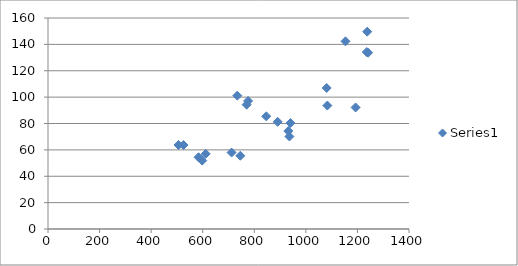
| Category | Series 0 |
|---|---|
| 506.0 | 63.717 |
| 846.4615384615385 | 85.445 |
| 1080.6153846153845 | 106.945 |
| 1083.3846153846155 | 93.613 |
| 525.3846153846154 | 63.649 |
| 890.6153846153846 | 81.263 |
| 745.7692307692307 | 55.567 |
| 1192.923076923077 | 92.158 |
| 611.5384615384615 | 56.995 |
| 597.9230769230769 | 51.887 |
| 940.2307692307693 | 80.358 |
| 931.9230769230769 | 74.308 |
| 936.3076923076923 | 70.144 |
| 583.7692307692307 | 54.406 |
| 775.9230769230769 | 97.1 |
| 734.0769230769231 | 101.104 |
| 770.4615384615385 | 94.277 |
| 1236.3076923076924 | 134.174 |
| 1241.3846153846155 | 133.72 |
| 1237.923076923077 | 149.627 |
| 1153.6153846153845 | 142.321 |
| 711.8461538461538 | 57.991 |